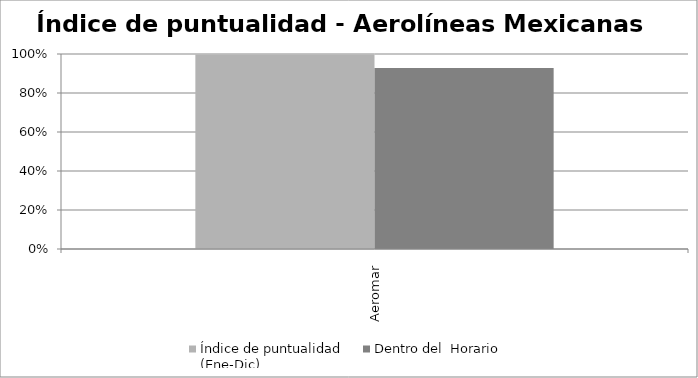
| Category | Índice de puntualidad
(Ene-Dic) | Dentro del  Horario |
|---|---|---|
| Aeromar | 0.998 | 0.928 |